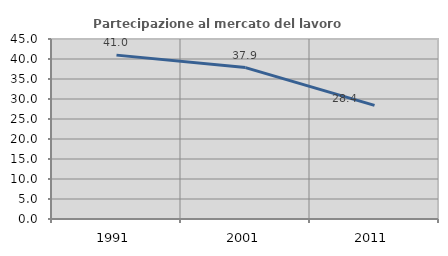
| Category | Partecipazione al mercato del lavoro  femminile |
|---|---|
| 1991.0 | 40.968 |
| 2001.0 | 37.857 |
| 2011.0 | 28.409 |